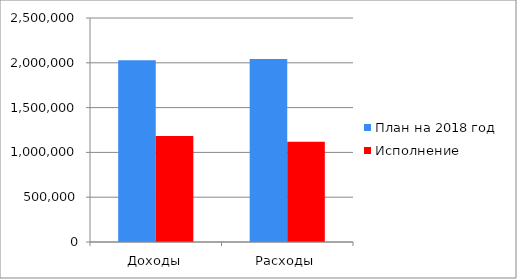
| Category | План на 2018 год | Исполнение |
|---|---|---|
| Доходы | 2027765 | 1182023 |
| Расходы | 2041294 | 1119004 |